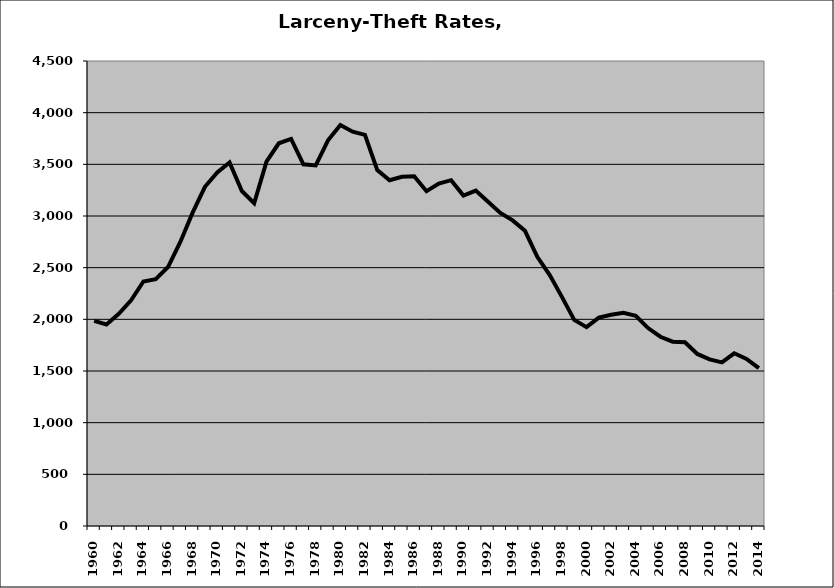
| Category | Larceny-Theft |
|---|---|
| 1960.0 | 1984.806 |
| 1961.0 | 1950.564 |
| 1962.0 | 2052.876 |
| 1963.0 | 2184.702 |
| 1964.0 | 2366.512 |
| 1965.0 | 2388.007 |
| 1966.0 | 2506.195 |
| 1967.0 | 2748.797 |
| 1968.0 | 3032.298 |
| 1969.0 | 3282.667 |
| 1970.0 | 3422.074 |
| 1971.0 | 3517.861 |
| 1972.0 | 3241.978 |
| 1973.0 | 3123.577 |
| 1974.0 | 3525.456 |
| 1975.0 | 3703.748 |
| 1976.0 | 3745.753 |
| 1977.0 | 3499.804 |
| 1978.0 | 3488.755 |
| 1979.0 | 3732.587 |
| 1980.0 | 3880.009 |
| 1981.0 | 3816.131 |
| 1982.0 | 3785.112 |
| 1983.0 | 3444.518 |
| 1984.0 | 3346.062 |
| 1985.0 | 3379.355 |
| 1986.0 | 3383.878 |
| 1987.0 | 3240.194 |
| 1988.0 | 3314.527 |
| 1989.0 | 3346.533 |
| 1990.0 | 3197.511 |
| 1991.0 | 3245.951 |
| 1992.0 | 3137.765 |
| 1993.0 | 3029.083 |
| 1994.0 | 2957.717 |
| 1995.0 | 2856.868 |
| 1996.0 | 2605.11 |
| 1997.0 | 2430.907 |
| 1998.0 | 2217.106 |
| 1999.0 | 1994.233 |
| 2000.0 | 1924.486 |
| 2001.0 | 2016.56 |
| 2002.0 | 2044.718 |
| 2003.0 | 2062.691 |
| 2004.0 | 2033.051 |
| 2005.0 | 1915.318 |
| 2006.0 | 1831.5 |
| 2007.0 | 1784.051 |
| 2008.0 | 1778.312 |
| 2009.0 | 1664.974 |
| 2010.0 | 1612.065 |
| 2011.0 | 1583.977 |
| 2012.0 | 1671.295 |
| 2013.0 | 1617.316 |
| 2014.0 | 1527.402 |